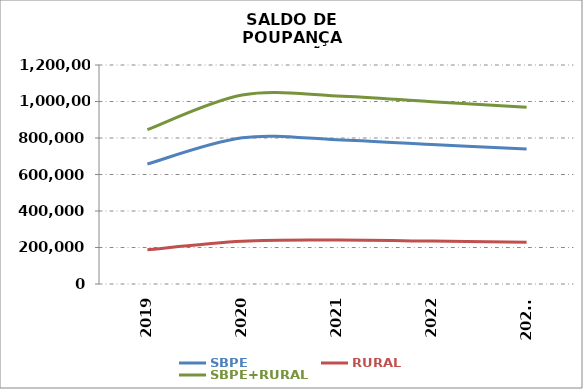
| Category | SBPE | RURAL | SBPE+RURAL |
|---|---|---|---|
| 2019 | 657531.442 | 187933.103 | 845464.545 |
| 2020 | 801437.985 | 234189.821 | 1035627.806 |
| 2021 | 790109.013 | 240493.997 | 1030603.01 |
| 2022 | 763815.066 | 235128.245 | 998943.311 |
| 2023* | 739139.471 | 228900.172 | 968039.643 |